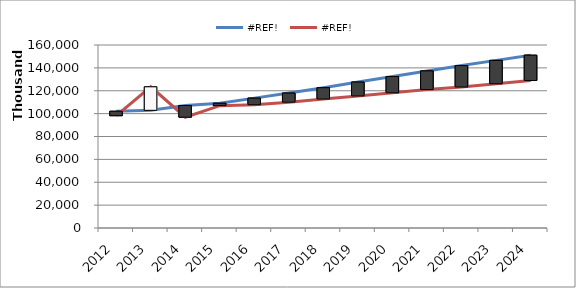
| Category | #REF! |
|---|---|
| 2012.0 | 98182288.1 |
| 2013.0 | 123444031.94 |
| 2014.0 | 96876666.03 |
| 2015.0 | 106989764 |
| 2016.0 | 107765643 |
| 2017.0 | 110014972 |
| 2018.0 | 112748977 |
| 2019.0 | 115439238 |
| 2020.0 | 118194065 |
| 2021.0 | 121015008 |
| 2022.0 | 123248892 |
| 2023.0 | 126083617 |
| 2024.0 | 128983540 |